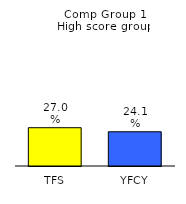
| Category | Series 0 |
|---|---|
| TFS | 0.27 |
| YFCY | 0.241 |